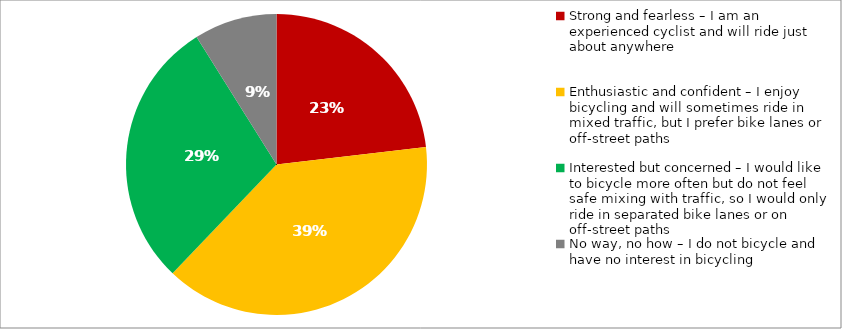
| Category | Responses |
|---|---|
| Strong and fearless – I am an experienced cyclist and will ride just about anywhere | 0.231 |
| Enthusiastic and confident – I enjoy bicycling and will sometimes ride in mixed traffic, but I prefer bike lanes or off-street paths | 0.39 |
| Interested but concerned – I would like to bicycle more often but do not feel safe mixing with traffic, so I would only ride in separated bike lanes or on off-street paths | 0.29 |
| No way, no how – I do not bicycle and have no interest in bicycling | 0.089 |